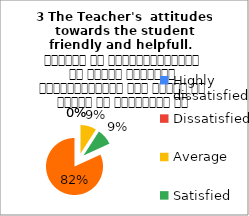
| Category | 3 The Teacher's  attitudes towards the student friendly and helpfull.   शिक्षक का विद्यार्थियों के प्रति व्यवहार मित्रतापूर्ण एवम सहयोग के भावना से परिपूर्ण था |
|---|---|
| Highly dissatisfied | 0 |
| Dissatisfied | 0 |
| Average | 3 |
| Satisfied | 3 |
| Highly satisfied | 27 |